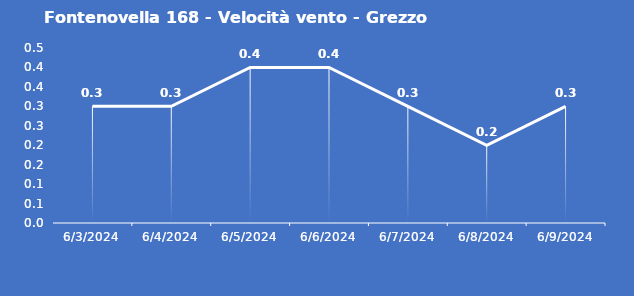
| Category | Fontenovella 168 - Velocità vento - Grezzo (m/s) |
|---|---|
| 6/3/24 | 0.3 |
| 6/4/24 | 0.3 |
| 6/5/24 | 0.4 |
| 6/6/24 | 0.4 |
| 6/7/24 | 0.3 |
| 6/8/24 | 0.2 |
| 6/9/24 | 0.3 |